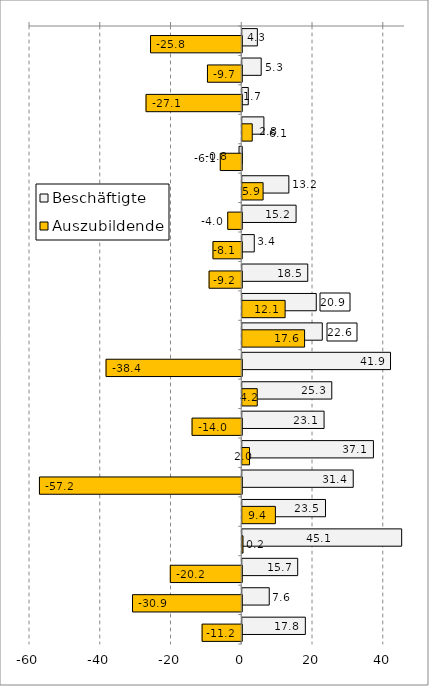
| Category | Beschäftigte | Auszubildende |
|---|---|---|
| 0 | 4.27 | -25.787 |
| 1 | 5.35 | -9.697 |
| 2 | 1.7 | -27.06 |
| 3 | 6.114 | 2.822 |
| 4 | -0.77 | -6.074 |
| 5 | 13.167 | 5.889 |
| 6 | 15.212 | -3.964 |
| 7 | 3.393 | -8.139 |
| 8 | 18.514 | -9.237 |
| 9 | 20.92 | 12.113 |
| 10 | 22.62 | 17.616 |
| 11 | 41.908 | -38.36 |
| 12 | 25.301 | 4.235 |
| 13 | 23.124 | -14.048 |
| 14 | 37.078 | 2.046 |
| 15 | 31.365 | -57.191 |
| 16 | 23.524 | 9.367 |
| 17 | 45.058 | 0.21 |
| 18 | 15.668 | -20.2 |
| 19 | 7.627 | -30.877 |
| 20 | 17.832 | -11.208 |